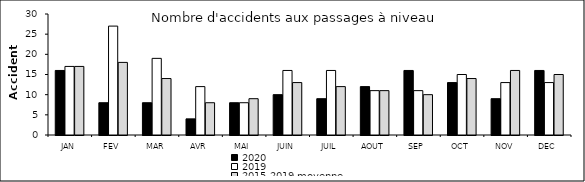
| Category | 2020 | 2019 | 2015-2019 moyenne |
|---|---|---|---|
| JAN | 16 | 17 | 17 |
| FEV | 8 | 27 | 18 |
| MAR | 8 | 19 | 14 |
| AVR | 4 | 12 | 8 |
| MAI | 8 | 8 | 9 |
| JUIN | 10 | 16 | 13 |
| JUIL | 9 | 16 | 12 |
| AOUT | 12 | 11 | 11 |
| SEP | 16 | 11 | 10 |
| OCT | 13 | 15 | 14 |
| NOV | 9 | 13 | 16 |
| DEC | 16 | 13 | 15 |